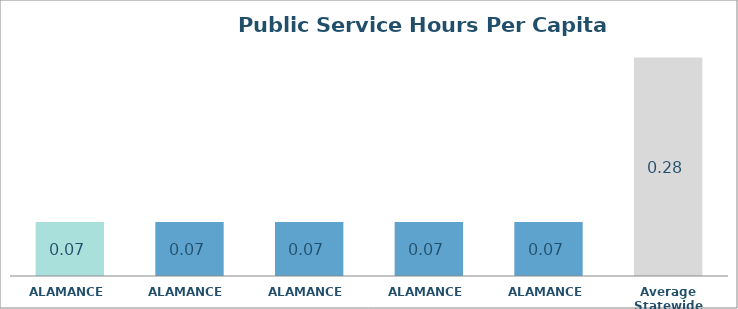
| Category | Series 0 |
|---|---|
| ALAMANCE  | 0.069 |
| ALAMANCE  | 0.069 |
| ALAMANCE  | 0.069 |
| ALAMANCE  | 0.069 |
| ALAMANCE  | 0.069 |
| Average Statewide | 0.281 |